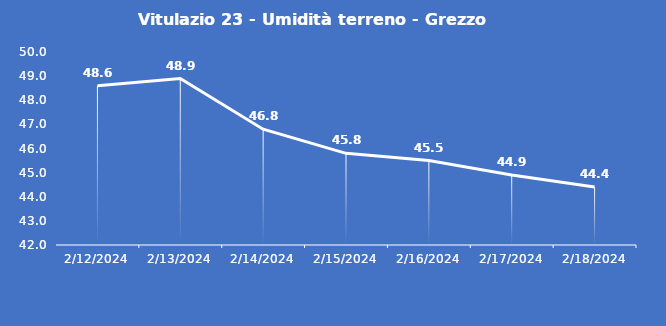
| Category | Vitulazio 23 - Umidità terreno - Grezzo (%VWC) |
|---|---|
| 2/12/24 | 48.6 |
| 2/13/24 | 48.9 |
| 2/14/24 | 46.8 |
| 2/15/24 | 45.8 |
| 2/16/24 | 45.5 |
| 2/17/24 | 44.9 |
| 2/18/24 | 44.4 |